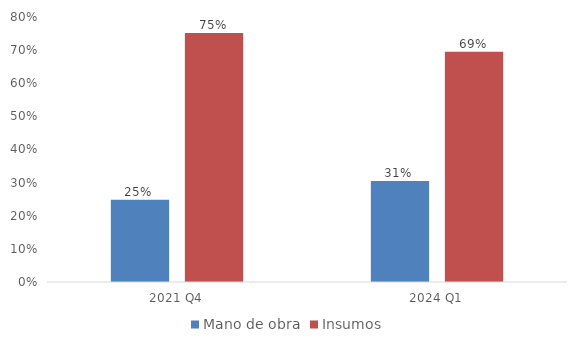
| Category | Mano de obra | Insumos |
|---|---|---|
| 2021 Q4 | 0.248 | 0.752 |
| 2024 Q1 | 0.305 | 0.695 |